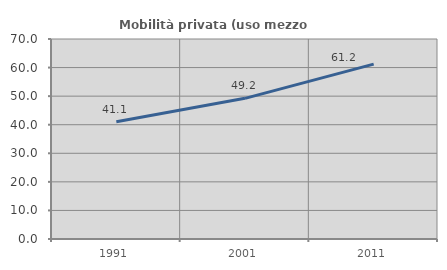
| Category | Mobilità privata (uso mezzo privato) |
|---|---|
| 1991.0 | 41.071 |
| 2001.0 | 49.231 |
| 2011.0 | 61.194 |